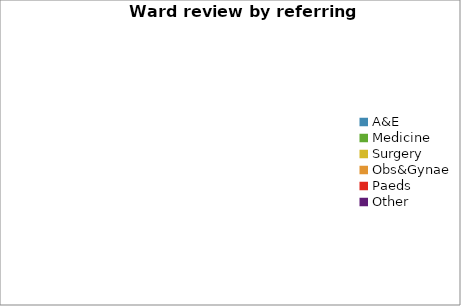
| Category | Series 0 |
|---|---|
| A&E | 0 |
| Medicine | 0 |
| Surgery | 0 |
| Obs&Gynae | 0 |
| Paeds | 0 |
| Other | 0 |